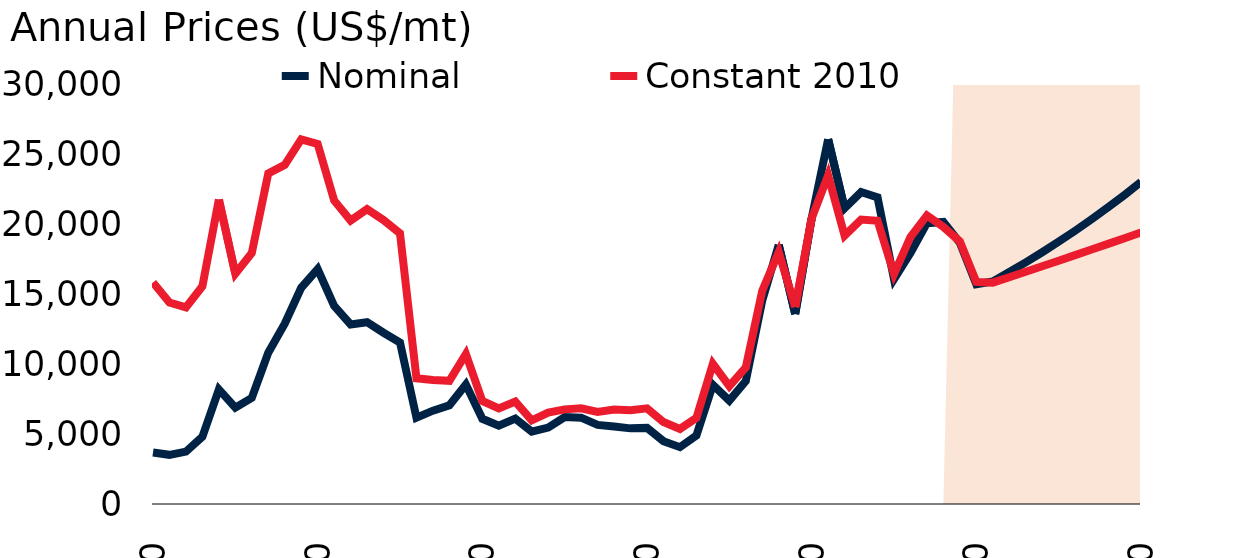
| Category | Nominal | Constant 2010 |
|---|---|---|
| 1970.0 | 3673.45 | 15823.873 |
| 1971.0 | 3511.967 | 14384.67 |
| 1972.0 | 3739.958 | 14042.753 |
| 1973.0 | 4802.2 | 15547.843 |
| 1974.0 | 8184.267 | 21743.57 |
| 1975.0 | 6876.575 | 16450.017 |
| 1976.0 | 7585.542 | 17925.957 |
| 1977.0 | 10804.45 | 23620.263 |
| 1978.0 | 12875.208 | 24220.766 |
| 1979.0 | 15447.408 | 26050.194 |
| 1980.0 | 16774.883 | 25718.742 |
| 1981.0 | 14159.125 | 21683.578 |
| 1982.0 | 12825.8 | 20244.675 |
| 1983.0 | 12987.967 | 21059.102 |
| 1984.0 | 12233.492 | 20282.132 |
| 1985.0 | 11539.042 | 19332.39 |
| 1986.0 | 6161.367 | 8974.953 |
| 1987.0 | 6664.833 | 8859.25 |
| 1988.0 | 7051.633 | 8802.092 |
| 1989.0 | 8534.433 | 10717.189 |
| 1990.0 | 6085.383 | 7360.844 |
| 1991.0 | 5595.042 | 6830.541 |
| 1992.0 | 6101.025 | 7311.595 |
| 1993.0 | 5161.142 | 5978.899 |
| 1994.0 | 5463.85 | 6525.565 |
| 1995.0 | 6213.808 | 6760.015 |
| 1996.0 | 6165.075 | 6837.273 |
| 1997.0 | 5646.767 | 6571.958 |
| 1998.0 | 5540.333 | 6742.449 |
| 1999.0 | 5403.617 | 6704.955 |
| 2000.0 | 5435.708 | 6832.245 |
| 2001.0 | 4484.442 | 5856.13 |
| 2002.0 | 4060.5 | 5365.155 |
| 2003.0 | 4894.897 | 6147.98 |
| 2004.0 | 8512.733 | 10011.909 |
| 2005.0 | 7379.828 | 8414.44 |
| 2006.0 | 8780.825 | 9764.484 |
| 2007.0 | 14536.834 | 15233.027 |
| 2008.0 | 18510.091 | 17999.989 |
| 2009.0 | 13573.877 | 14071.719 |
| 2010.0 | 20405.623 | 20405.623 |
| 2011.0 | 26053.675 | 23472.679 |
| 2012.0 | 21125.994 | 19174.915 |
| 2013.0 | 22282.797 | 20313.502 |
| 2014.0 | 21898.872 | 20235.988 |
| 2015.0 | 16066.632 | 16418.318 |
| 2016.0 | 17933.762 | 19071.642 |
| 2017.0 | 20061.169 | 20613.336 |
| 2018.0 | 20145.206 | 19792.951 |
| 2019.0 | 18661.157 | 18759.075 |
| 2020.0 | 15700 | 15860.264 |
| 2021.0 | 15900 | 15809.756 |
| 2022.0 | 16565.771 | 16200.278 |
| 2023.0 | 17259.419 | 16590.778 |
| 2024.0 | 17982.112 | 16982.666 |
| 2025.0 | 18735.066 | 17376.876 |
| 2026.0 | 19519.547 | 17774.051 |
| 2027.0 | 20336.877 | 18174.639 |
| 2028.0 | 21188.431 | 18578.951 |
| 2029.0 | 22075.64 | 18987.197 |
| 2030.0 | 23000 | 19399.509 |